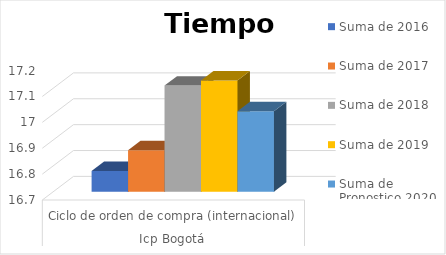
| Category | Suma de 2016 | Suma de 2017 | Suma de 2018 | Suma de 2019 | Suma de Pronostico 2020 suavización |
|---|---|---|---|---|---|
| 0 | 16.78 | 16.86 | 17.11 | 17.13 | 17.011 |